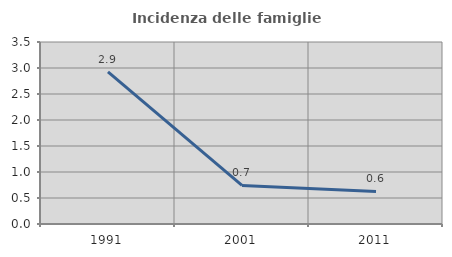
| Category | Incidenza delle famiglie numerose |
|---|---|
| 1991.0 | 2.926 |
| 2001.0 | 0.742 |
| 2011.0 | 0.626 |